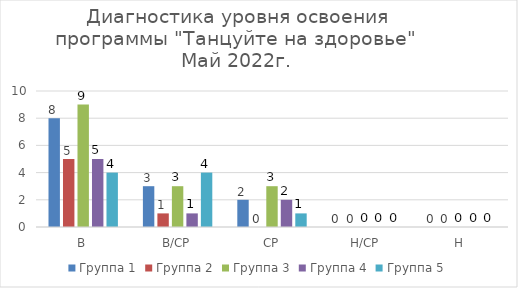
| Category | Группа 1 | Группа 2 | Группа 3 | Группа 4 | Группа 5 |
|---|---|---|---|---|---|
| В | 8 | 5 | 9 | 5 | 4 |
| В/СР | 3 | 1 | 3 | 1 | 4 |
| СР | 2 | 0 | 3 | 2 | 1 |
| Н/СР | 0 | 0 | 0 | 0 | 0 |
| Н | 0 | 0 | 0 | 0 | 0 |